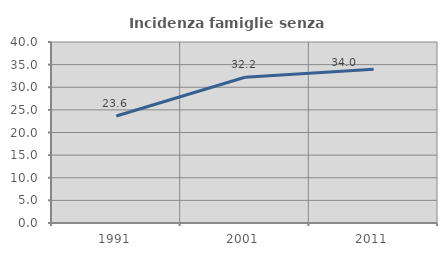
| Category | Incidenza famiglie senza nuclei |
|---|---|
| 1991.0 | 23.639 |
| 2001.0 | 32.205 |
| 2011.0 | 33.964 |